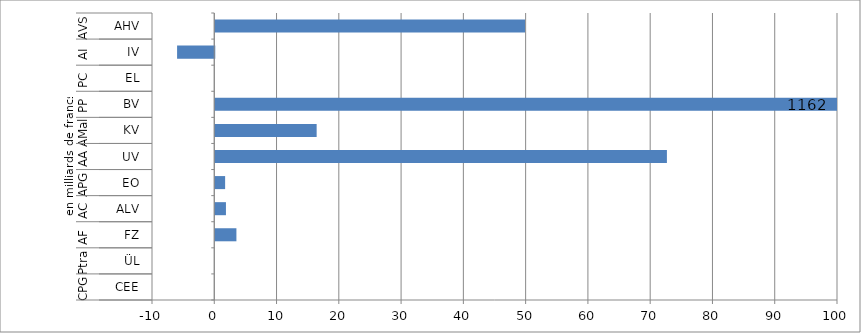
| Category | 2021 |
|---|---|
| 0 | 49.741 |
| 1 | -5.971 |
| 2 | 0 |
| 3 | 1161.71 |
| 4 | 16.28 |
| 5 | 72.526 |
| 6 | 1.582 |
| 7 | 1.714 |
| 8 | 3.395 |
| 9 | 0 |
| 10 | 0 |